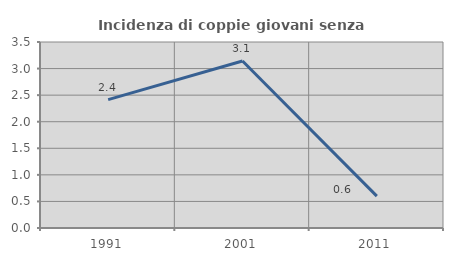
| Category | Incidenza di coppie giovani senza figli |
|---|---|
| 1991.0 | 2.415 |
| 2001.0 | 3.141 |
| 2011.0 | 0.599 |